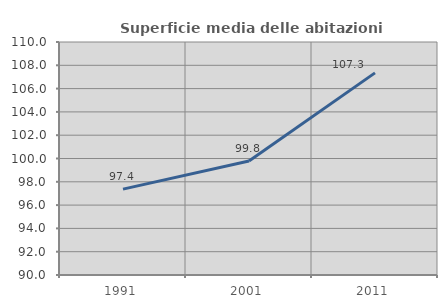
| Category | Superficie media delle abitazioni occupate |
|---|---|
| 1991.0 | 97.371 |
| 2001.0 | 99.792 |
| 2011.0 | 107.35 |